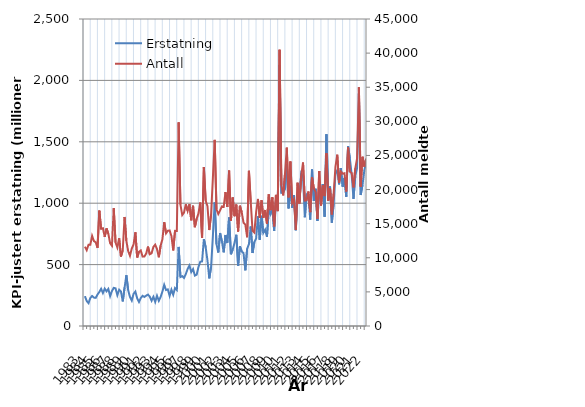
| Category | Erstatning |
|---|---|
| 1983.0 | 242.908 |
| nan | 203.473 |
| nan | 186.076 |
| nan | 227.936 |
| 1984.0 | 244.422 |
| nan | 231.205 |
| nan | 229.236 |
| nan | 256.401 |
| 1985.0 | 277.076 |
| nan | 302.852 |
| nan | 268.362 |
| nan | 304.359 |
| 1986.0 | 282.187 |
| nan | 301.952 |
| nan | 243.031 |
| nan | 284.402 |
| 1987.0 | 310.704 |
| nan | 306.607 |
| nan | 250.909 |
| nan | 295.203 |
| 1988.0 | 280.974 |
| nan | 200.291 |
| nan | 311.958 |
| nan | 413.257 |
| 1989.0 | 291.956 |
| nan | 235.971 |
| nan | 207.635 |
| nan | 261.954 |
| 1990.0 | 280.484 |
| nan | 225.65 |
| nan | 195.699 |
| nan | 227.786 |
| 1991.0 | 245.803 |
| nan | 236.338 |
| nan | 247.344 |
| nan | 255.723 |
| 1992.0 | 238.892 |
| nan | 205.843 |
| nan | 237.846 |
| nan | 196.27 |
| 1993.0 | 246.265 |
| nan | 204.947 |
| nan | 236.78 |
| nan | 280.118 |
| 1994.0 | 335.503 |
| nan | 293.306 |
| nan | 297.995 |
| nan | 245.622 |
| 1995.0 | 295.923 |
| nan | 254.582 |
| nan | 309.343 |
| nan | 293.706 |
| 1996.0 | 644.096 |
| nan | 398.835 |
| nan | 405.96 |
| nan | 391.517 |
| 1997.0 | 423.851 |
| nan | 465.105 |
| nan | 492.551 |
| nan | 439.47 |
| 1998.0 | 463.63 |
| nan | 410.732 |
| nan | 417.442 |
| nan | 479.803 |
| 1999.0 | 523.327 |
| nan | 525.869 |
| nan | 707.624 |
| nan | 640.847 |
| 2000.0 | 534.188 |
| nan | 387.938 |
| nan | 480.933 |
| nan | 733.275 |
| 2001.0 | 1006.336 |
| nan | 666.198 |
| nan | 598.334 |
| nan | 757.016 |
| 2002.0 | 689.457 |
| nan | 599.895 |
| nan | 741.367 |
| nan | 675.55 |
| 2003.0 | 883.527 |
| nan | 584.156 |
| nan | 621.468 |
| nan | 676.998 |
| 2004.0 | 742.703 |
| nan | 491.025 |
| nan | 649.155 |
| nan | 606.761 |
| 2005.0 | 593.87 |
| nan | 453.205 |
| nan | 629.171 |
| nan | 666.763 |
| 2006.0 | 810.462 |
| nan | 594.362 |
| nan | 683.887 |
| nan | 713.484 |
| 2007.0 | 893.066 |
| nan | 702.139 |
| nan | 897.1 |
| nan | 758.481 |
| 2008.0 | 784.369 |
| nan | 726.128 |
| nan | 948.365 |
| nan | 910.807 |
| 2009.0 | 955.79 |
| nan | 775.949 |
| nan | 1025.008 |
| nan | 968.847 |
| 2010.0 | 2125.258 |
| nan | 1083.987 |
| nan | 1089.202 |
| nan | 1114.3 |
| 2011.0 | 1316.898 |
| nan | 957.618 |
| nan | 1141.812 |
| nan | 962.279 |
| 2012.0 | 1066.073 |
| nan | 779.397 |
| nan | 1074.57 |
| nan | 1011.809 |
| 2013.0 | 1242.608 |
| nan | 1216.748 |
| nan | 885.362 |
| nan | 1069.414 |
| 2014.0 | 1054.729 |
| nan | 866.141 |
| nan | 1274.139 |
| nan | 1018.751 |
| 2015.0 | 1117.702 |
| nan | 855.963 |
| nan | 1133.052 |
| nan | 1006.02 |
| 2016.0 | 1156.499 |
| nan | 890.2 |
| nan | 1561.253 |
| nan | 1059.311 |
| 2017.0 | 1135.566 |
| nan | 842.222 |
| nan | 994.673 |
| nan | 1242.016 |
| 2018.0 | 1267.919 |
| nan | 1153.469 |
| nan | 1285.718 |
| nan | 1134.38 |
| 2019.0 | 1206.678 |
| nan | 1052.136 |
| nan | 1464.337 |
| nan | 1363.708 |
| 2020.0 | 1232.942 |
| nan | 1035.668 |
| nan | 1222.052 |
| nan | 1285 |
| 2021.0 | 1894.091 |
| nan | 1067.092 |
| nan | 1148.051 |
| nan | 1265.549 |
| 2022.0 | 1335.287 |